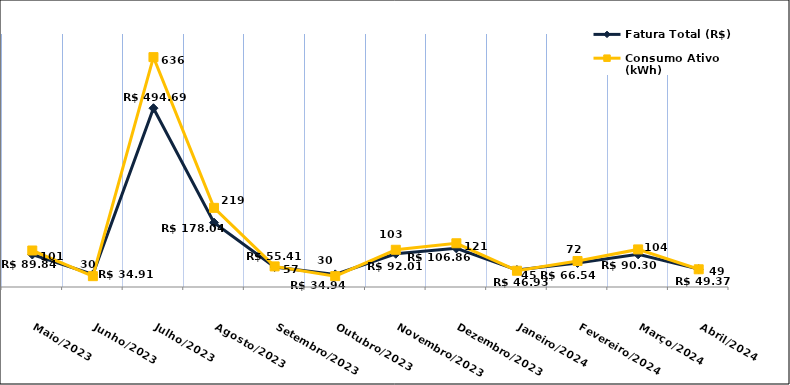
| Category | Fatura Total (R$) |
|---|---|
| Maio/2023 | 89.84 |
| Junho/2023 | 34.91 |
| Julho/2023 | 494.69 |
| Agosto/2023 | 178.04 |
| Setembro/2023 | 55.41 |
| Outubro/2023 | 34.94 |
| Novembro/2023 | 92.01 |
| Dezembro/2023 | 106.86 |
| Janeiro/2024 | 46.93 |
| Fevereiro/2024 | 66.54 |
| Março/2024 | 90.3 |
| Abril/2024 | 49.37 |